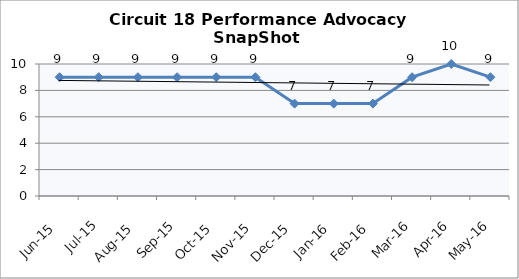
| Category | Circuit 18 |
|---|---|
| Jun-15 | 9 |
| Jul-15 | 9 |
| Aug-15 | 9 |
| Sep-15 | 9 |
| Oct-15 | 9 |
| Nov-15 | 9 |
| Dec-15 | 7 |
| Jan-16 | 7 |
| Feb-16 | 7 |
| Mar-16 | 9 |
| Apr-16 | 10 |
| May-16 | 9 |